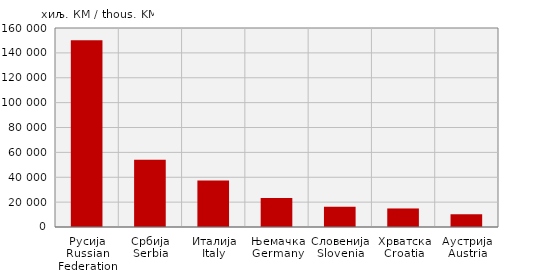
| Category | Увоз
Import |
|---|---|
| Русија
Russian Federation | 150201 |
| Србија
Serbia | 53970 |
| Италија
Italy | 37302 |
| Њемачка
Germany | 23345 |
| Словенија
Slovenia | 16332 |
| Хрватска
Croatia | 14903 |
| Аустрија
Austria | 10281 |